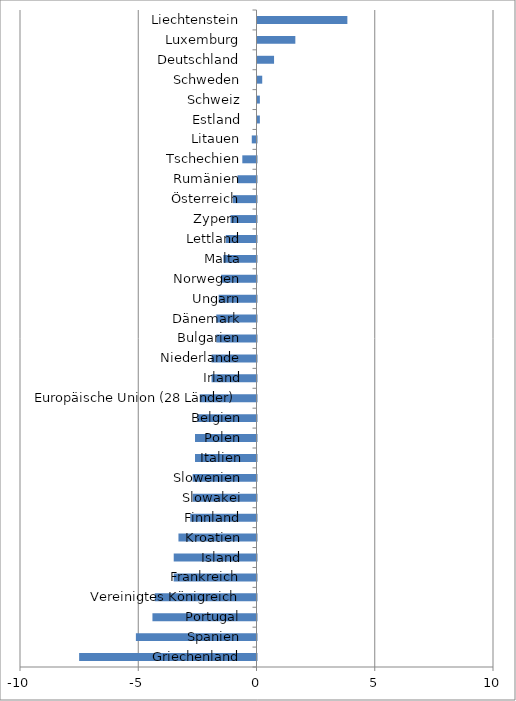
| Category | Series 0 |
|---|---|
| Griechenland | -7.5 |
| Spanien | -5.1 |
| Portugal | -4.4 |
| Vereinigtes Königreich | -4.3 |
| Frankreich | -3.5 |
| Island | -3.5 |
| Kroatien | -3.3 |
| Finnland | -2.8 |
| Slowakei | -2.7 |
| Slowenien | -2.7 |
| Italien | -2.6 |
| Polen | -2.6 |
| Belgien | -2.5 |
| Europäische Union (28 Länder) | -2.4 |
| Irland | -1.9 |
| Niederlande | -1.9 |
| Bulgarien | -1.7 |
| Dänemark | -1.7 |
| Ungarn | -1.6 |
| Norwegen | -1.5 |
| Malta | -1.4 |
| Lettland | -1.3 |
| Zypern | -1.1 |
| Österreich | -1 |
| Rumänien | -0.8 |
| Tschechien | -0.6 |
| Litauen | -0.2 |
| Estland | 0.1 |
| Schweiz | 0.1 |
| Schweden | 0.2 |
| Deutschland | 0.7 |
| Luxemburg | 1.6 |
| Liechtenstein | 3.8 |